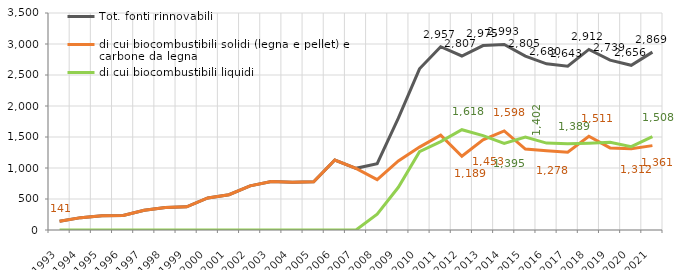
| Category | Tot. fonti rinnovabili | di cui biocombustibili solidi (legna e pellet) e carbone da legna  | di cui biocombustibili liquidi |
|---|---|---|---|
| 1993 | 140.847 | 140.847 | 0 |
| 1994 | 199.412 | 199.412 | 0 |
| 1995 | 231.513 | 231.513 | 0 |
| 1996 | 234.308 | 234.308 | 0 |
| 1997 | 319.815 | 319.815 | 0 |
| 1998 | 363.523 | 363.523 | 0 |
| 1999 | 374.033 | 374.033 | 0 |
| 2000 | 517.441 | 517.44 | 0 |
| 2001 | 568.444 | 568.444 | 0 |
| 2002 | 712.162 | 712.162 | 0 |
| 2003 | 780.52 | 780.519 | 0 |
| 2004 | 770.44 | 770.441 | 0 |
| 2005 | 778.303 | 778.303 | 0 |
| 2006 | 1128.126 | 1128.127 | 0 |
| 2007 | 994.822 | 994.822 | 0 |
| 2008 | 1069.006 | 812.731 | 256.275 |
| 2009 | 1803.797 | 1114.952 | 688.845 |
| 2010 | 2599.614 | 1337.136 | 1262.478 |
| 2011 | 2956.503 | 1530.697 | 1425.806 |
| 2012 | 2806.627 | 1188.951 | 1617.676 |
| 2013 | 2974.875 | 1452.842 | 1522.033 |
| 2014 | 2993.436 | 1597.993 | 1395.442 |
| 2015 | 2805.389 | 1304.872 | 1500.517 |
| 2016 | 2679.714 | 1277.629 | 1402.085 |
| 2017 | 2643.272 | 1254.064 | 1389.207 |
| 2018 | 2912.187 | 1511.343 | 1400.844 |
| 2019 | 2738.714 | 1323.957 | 1414.757 |
| 2020 | 2656.43 | 1312.269 | 1344.16 |
| 2021 | 2868.647 | 1360.983 | 1507.663 |